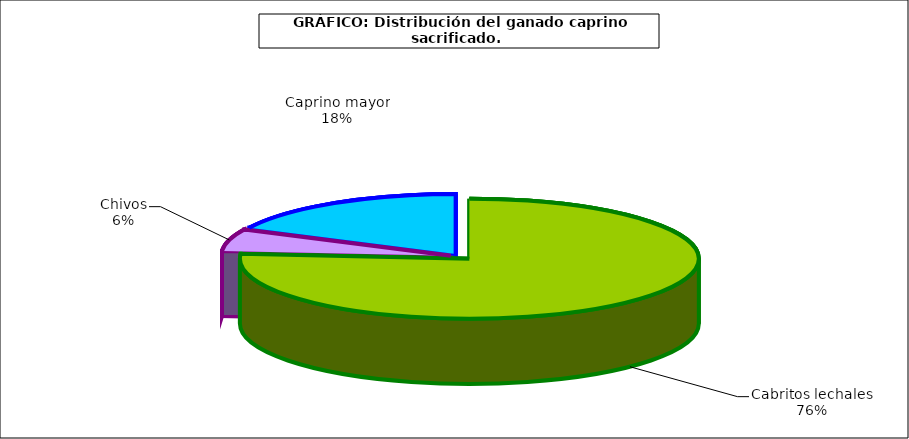
| Category | Series 0 |
|---|---|
| 0 | 994215 |
| 1 | 77091 |
| 2 | 232094 |